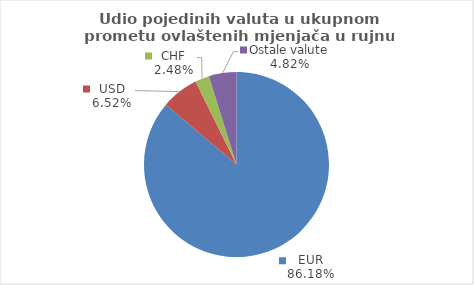
| Category | Series 0 |
|---|---|
| EUR | 86.182 |
| USD | 6.515 |
| CHF | 2.483 |
| Ostale valute | 4.819 |